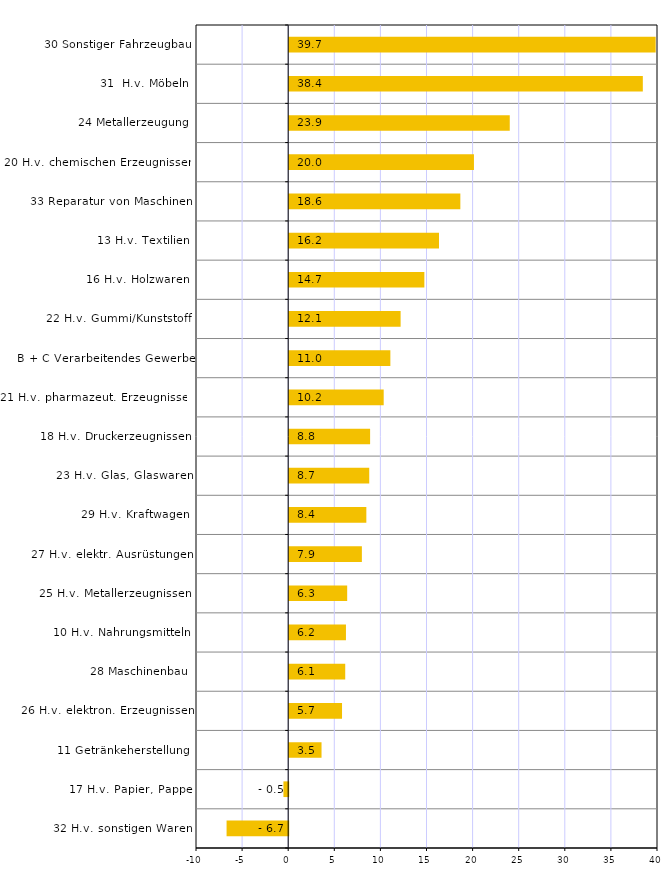
| Category | Series 0 |
|---|---|
| 32 H.v. sonstigen Waren | -6.683 |
| 17 H.v. Papier, Pappe | -0.519 |
| 11 Getränkeherstellung | 3.507 |
| 26 H.v. elektron. Erzeugnissen | 5.73 |
| 28 Maschinenbau | 6.077 |
| 10 H.v. Nahrungsmitteln | 6.156 |
| 25 H.v. Metallerzeugnissen | 6.288 |
| 27 H.v. elektr. Ausrüstungen | 7.882 |
| 29 H.v. Kraftwagen | 8.367 |
| 23 H.v. Glas, Glaswaren | 8.681 |
| 18 H.v. Druckerzeugnissen | 8.775 |
| 21 H.v. pharmazeut. Erzeugnissen | 10.249 |
| B + C Verarbeitendes Gewerbe | 10.972 |
| 22 H.v. Gummi/Kunststoff | 12.084 |
| 16 H.v. Holzwaren | 14.659 |
| 13 H.v. Textilien | 16.247 |
| 33 Reparatur von Maschinen | 18.561 |
| 20 H.v. chemischen Erzeugnissen | 20.038 |
| 24 Metallerzeugung | 23.922 |
| 31  H.v. Möbeln | 38.354 |
| 30 Sonstiger Fahrzeugbau | 39.747 |